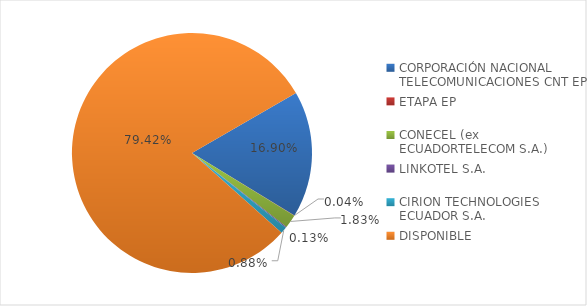
| Category | CODIGO DE AREA 2 |
|---|---|
| CORPORACIÓN NACIONAL TELECOMUNICACIONES CNT EP | 0.169 |
| ETAPA EP | 0 |
| CONECEL (ex ECUADORTELECOM S.A.) | 0.018 |
| LINKOTEL S.A. | 0.001 |
| CIRION TECHNOLOGIES ECUADOR S.A. | 0.009 |
| DISPONIBLE | 0.794 |